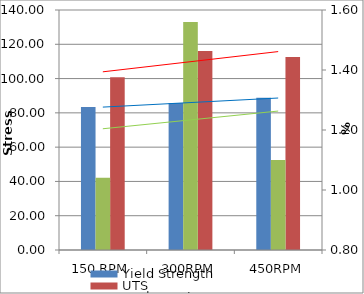
| Category | Yield Strength | UTS |
|---|---|---|
| 150 RPM | 83.48 | 100.8 |
| 300RPM | 85.76 | 116.12 |
| 450RPM | 88.78 | 112.6 |